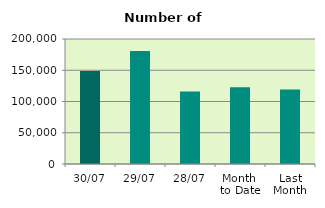
| Category | Series 0 |
|---|---|
| 30/07 | 148700 |
| 29/07 | 180954 |
| 28/07 | 116068 |
| Month 
to Date | 122991 |
| Last
Month | 119107.818 |